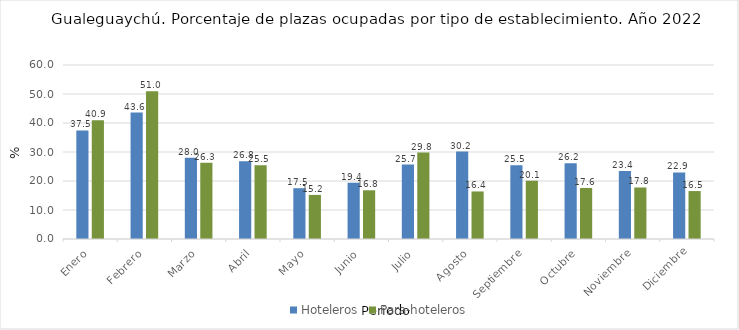
| Category | Hoteleros | Para-hoteleros |
|---|---|---|
| Enero | 37.453 | 40.911 |
| Febrero | 43.598 | 50.971 |
| Marzo | 27.976 | 26.308 |
| Abril | 26.812 | 25.457 |
| Mayo | 17.513 | 15.204 |
| Junio | 19.406 | 16.793 |
| Julio | 25.659 | 29.797 |
| Agosto | 30.151 | 16.397 |
| Septiembre | 25.467 | 20.109 |
| Octubre | 26.163 | 17.58 |
| Noviembre | 23.441 | 17.762 |
| Diciembre | 22.938 | 16.529 |